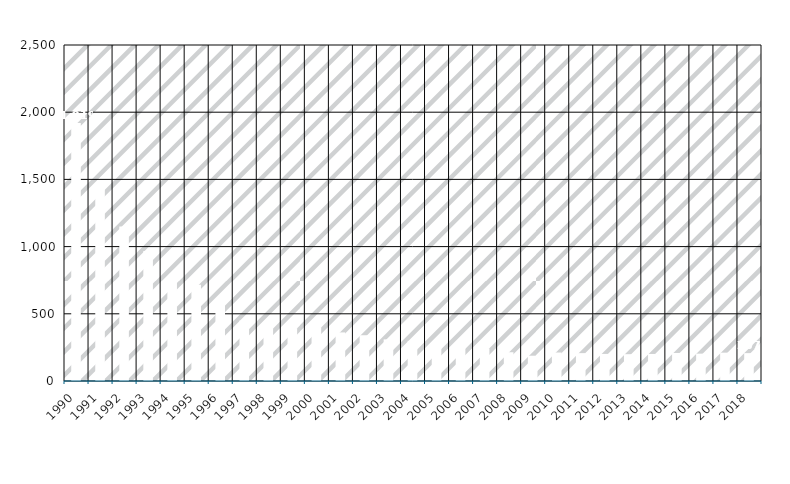
| Category | Blei |
|---|---|
| 1990.0 | 1919.4 |
| 1991.0 | 1476 |
| 1992.0 | 1149.7 |
| 1993.0 | 966.8 |
| 1994.0 | 776.1 |
| 1995.0 | 716.4 |
| 1996.0 | 578.2 |
| 1997.0 | 450.5 |
| 1998.0 | 403.4 |
| 1999.0 | 393.2 |
| 2000.0 | 400.6 |
| 2001.0 | 361.6 |
| 2002.0 | 340.6 |
| 2003.0 | 309.7 |
| 2004.0 | 298.3 |
| 2005.0 | 269.3 |
| 2006.0 | 256.8 |
| 2007.0 | 240.6 |
| 2008.0 | 214.2 |
| 2009.0 | 188.2 |
| 2010.0 | 211.9 |
| 2011.0 | 207.4 |
| 2012.0 | 201.6 |
| 2013.0 | 199.6 |
| 2014.0 | 201.3 |
| 2015.0 | 208.6 |
| 2016.0 | 203.5 |
| 2017.0 | 210.9 |
| 2018.0 | 207.4 |